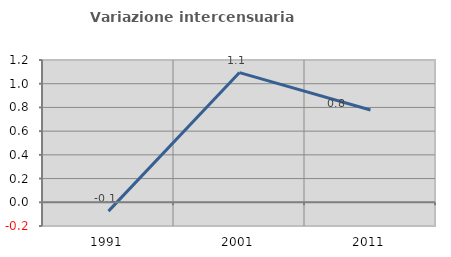
| Category | Variazione intercensuaria annua |
|---|---|
| 1991.0 | -0.075 |
| 2001.0 | 1.094 |
| 2011.0 | 0.778 |